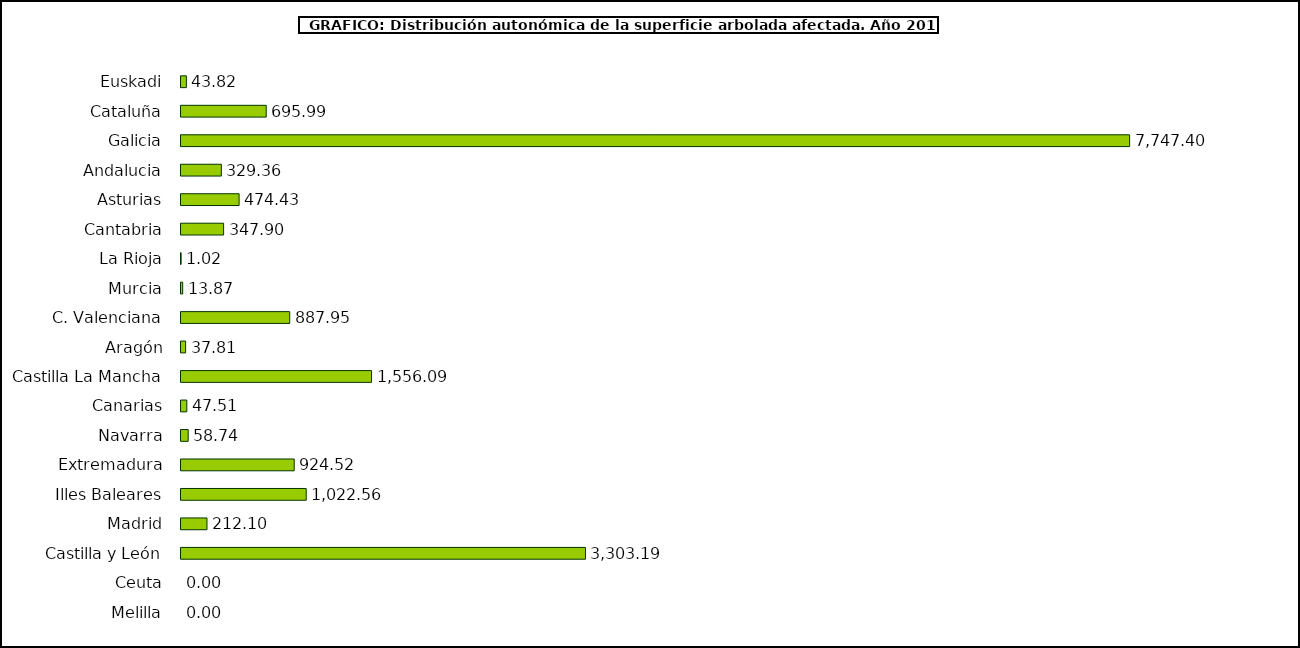
| Category | Superficie Arbolada afectada |
|---|---|
| Euskadi | 43.82 |
| Cataluña | 695.99 |
| Galicia | 7747.4 |
| Andalucia | 329.36 |
| Asturias | 474.43 |
| Cantabria | 347.9 |
| La Rioja | 1.02 |
| Murcia | 13.87 |
| C. Valenciana | 887.95 |
| Aragón | 37.81 |
| Castilla La Mancha | 1556.09 |
| Canarias | 47.51 |
| Navarra | 58.74 |
| Extremadura | 924.52 |
| Illes Baleares | 1022.56 |
| Madrid | 212.1 |
| Castilla y León | 3303.19 |
| Ceuta | 0 |
| Melilla | 0 |